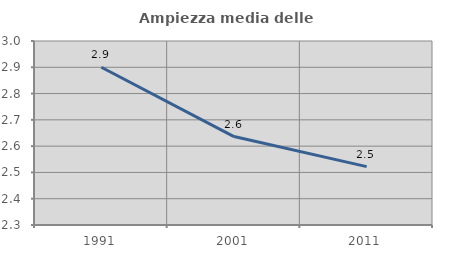
| Category | Ampiezza media delle famiglie |
|---|---|
| 1991.0 | 2.9 |
| 2001.0 | 2.636 |
| 2011.0 | 2.522 |